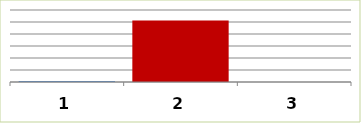
| Category | Series 0 |
|---|---|
| 0 | 87772 |
| 1 | 5128556 |
| 2 | 0 |